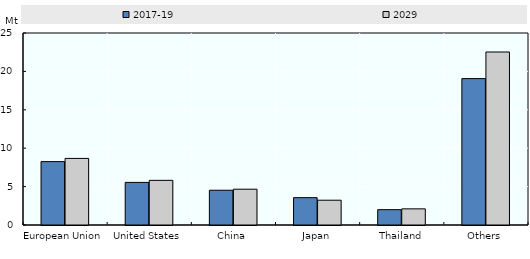
| Category | 2017-19 | 2029 |
|---|---|---|
| European Union | 8.252 | 8.67 |
| United States | 5.546 | 5.814 |
| China | 4.525 | 4.662 |
| Japan | 3.56 | 3.227 |
| Thailand | 1.997 | 2.103 |
| Others | 19.063 | 22.526 |